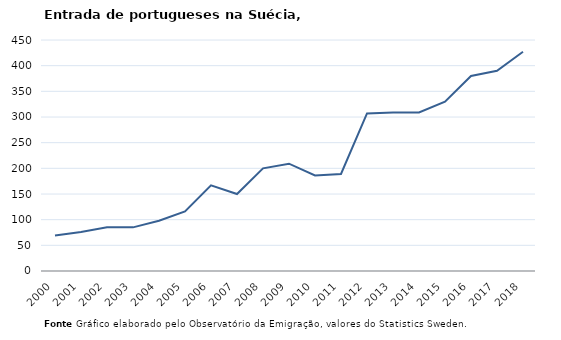
| Category | Entradas |
|---|---|
| 2000.0 | 69 |
| 2001.0 | 76 |
| 2002.0 | 85 |
| 2003.0 | 85 |
| 2004.0 | 98 |
| 2005.0 | 116 |
| 2006.0 | 167 |
| 2007.0 | 150 |
| 2008.0 | 200 |
| 2009.0 | 209 |
| 2010.0 | 186 |
| 2011.0 | 189 |
| 2012.0 | 307 |
| 2013.0 | 309 |
| 2014.0 | 309 |
| 2015.0 | 330 |
| 2016.0 | 380 |
| 2017.0 | 390 |
| 2018.0 | 427 |